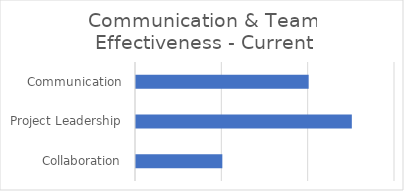
| Category | Current |
|---|---|
| Collaboration | 1 |
| Project Leadership | 2.5 |
| Communication | 2 |